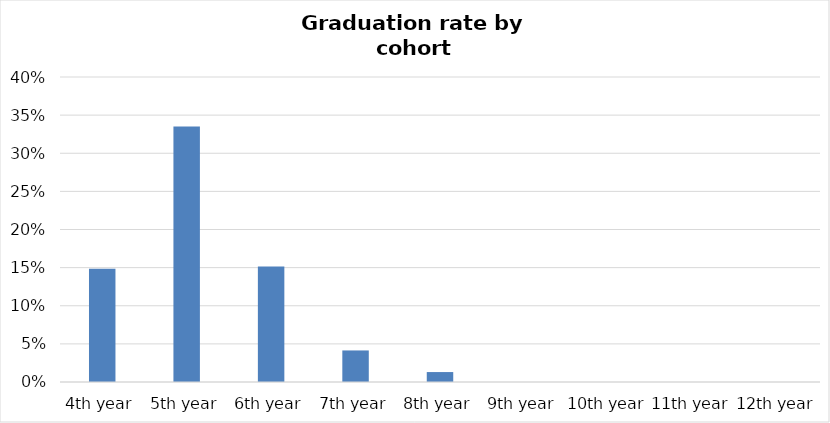
| Category | Series 0 |
|---|---|
| 4th year | 0.149 |
| 5th year | 0.335 |
| 6th year | 0.151 |
| 7th year | 0.041 |
| 8th year | 0.013 |
| 9th year | 0 |
| 10th year | 0 |
| 11th year | 0 |
| 12th year | 0 |